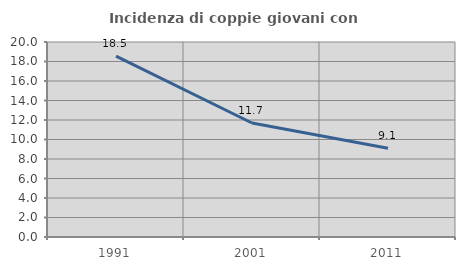
| Category | Incidenza di coppie giovani con figli |
|---|---|
| 1991.0 | 18.546 |
| 2001.0 | 11.695 |
| 2011.0 | 9.108 |